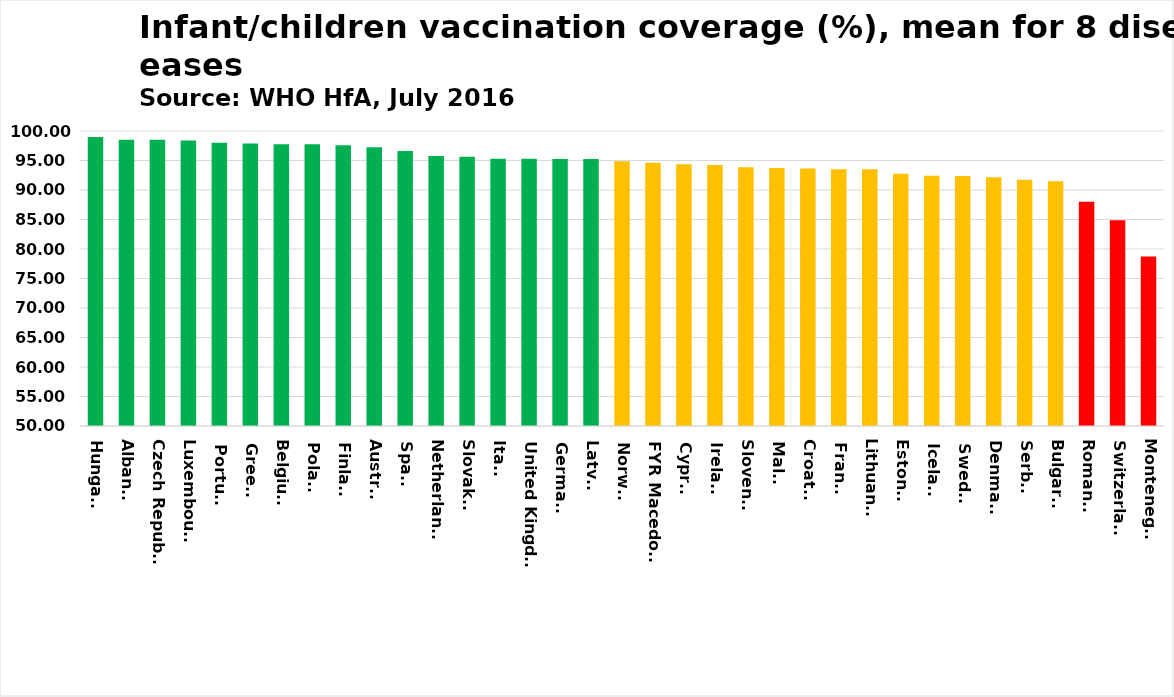
| Category | Series 0 |
|---|---|
| Hungary | 99 |
| Albania | 98.5 |
| Czech Republic | 98.5 |
| Luxembourg | 98.375 |
| Portugal | 98 |
| Greece | 97.875 |
| Belgium | 97.75 |
| Poland | 97.75 |
| Finland | 97.571 |
| Austria | 97.25 |
| Spain | 96.625 |
| Netherlands | 95.75 |
| Slovakia | 95.625 |
| Italy | 95.3 |
| United Kingdom | 95.286 |
| Germany | 95.25 |
| Latvia | 95.25 |
| Norway | 94.857 |
| FYR Macedonia | 94.625 |
| Cyprus | 94.375 |
| Ireland | 94.25 |
| Slovenia | 93.875 |
| Malta | 93.75 |
| Croatia | 93.625 |
| France | 93.5 |
| Lithuania | 93.5 |
| Estonia | 92.75 |
| Iceland | 92.429 |
| Sweden | 92.375 |
| Denmark | 92.143 |
| Serbia | 91.75 |
| Bulgaria | 91.5 |
| Romania | 88 |
| Switzerland | 84.875 |
| Montenegro | 78.75 |